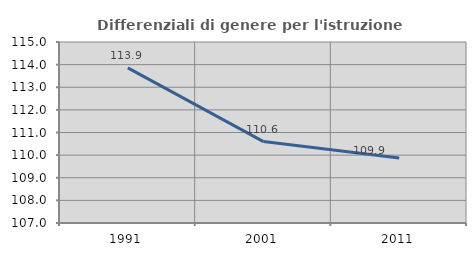
| Category | Differenziali di genere per l'istruzione superiore |
|---|---|
| 1991.0 | 113.859 |
| 2001.0 | 110.599 |
| 2011.0 | 109.875 |